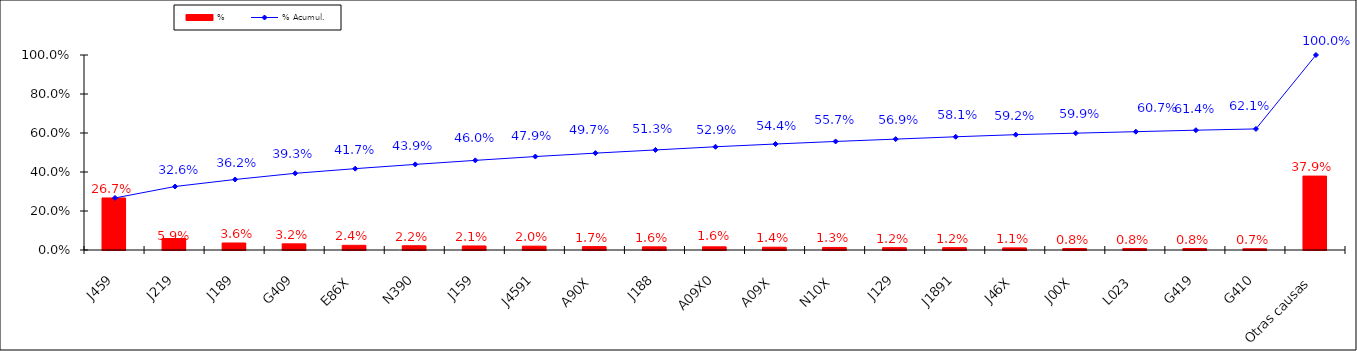
| Category | % |
|---|---|
| J459 | 0.267 |
| J219 | 0.059 |
| J189 | 0.036 |
| G409 | 0.032 |
| E86X | 0.024 |
| N390 | 0.022 |
| J159 | 0.021 |
| J4591 | 0.02 |
| A90X | 0.017 |
| J188 | 0.016 |
| A09X0 | 0.016 |
| A09X | 0.014 |
| N10X | 0.013 |
| J129 | 0.012 |
| J1891 | 0.012 |
| J46X | 0.011 |
| J00X | 0.008 |
| L023 | 0.008 |
| G419 | 0.008 |
| G410 | 0.007 |
| Otras causas | 0.379 |